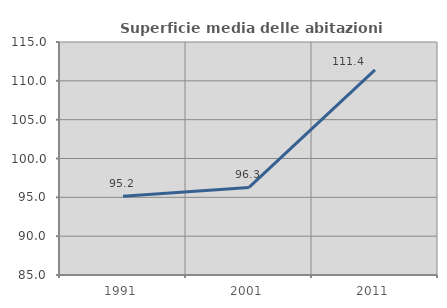
| Category | Superficie media delle abitazioni occupate |
|---|---|
| 1991.0 | 95.151 |
| 2001.0 | 96.27 |
| 2011.0 | 111.421 |